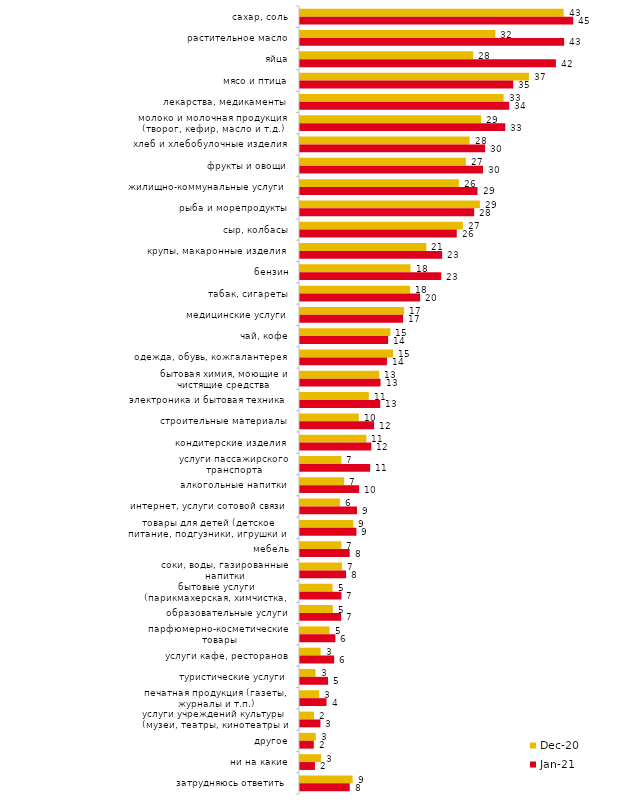
| Category | дек.20 | янв.21 |
|---|---|---|
| сахар, соль | 42.935 | 44.511 |
| растительное масло | 31.829 | 43.02 |
| яйца | 28.21 | 41.679 |
| мясо и птица | 37.283 | 34.724 |
| лекарства, медикаменты | 33.168 | 34.078 |
| молоко и молочная продукция (творог, кефир, масло и т.д.) | 29.499 | 33.433 |
| хлеб и хлебобулочные изделия | 27.615 | 30.154 |
| фрукты и овощи | 27.02 | 29.806 |
| жилищно-коммунальные услуги | 25.88 | 28.912 |
| рыба и морепродукты | 29.301 | 28.366 |
| сыр, колбасы | 26.525 | 25.534 |
| крупы, макаронные изделия | 20.575 | 23.15 |
| бензин | 17.997 | 23 |
| табак, сигареты | 17.947 | 19.573 |
| медицинские услуги | 16.956 | 16.791 |
| чай, кофе | 14.725 | 14.357 |
| одежда, обувь, кожгалантерея | 15.171 | 14.158 |
| бытовая химия, моющие и чистящие средства | 12.89 | 13.115 |
| электроника и бытовая техника | 11.205 | 13.065 |
| строительные материалы | 9.569 | 12.072 |
| кондитерские изделия | 10.808 | 11.624 |
| услуги пассажирского транспорта | 6.743 | 11.426 |
| алкогольные напитки | 7.189 | 9.637 |
| интернет, услуги сотовой связи | 6.495 | 9.29 |
| товары для детей (детское питание, подгузники, игрушки и т.п.) | 8.676 | 9.19 |
| мебель | 6.743 | 8.097 |
| соки, воды, газированные напитки | 6.842 | 7.501 |
| бытовые услуги (парикмахерская, химчистка, ателье и т.д.) | 5.305 | 6.756 |
| образовательные услуги | 5.354 | 6.706 |
| парфюмерно-косметические товары | 4.809 | 5.763 |
| услуги кафе, ресторанов | 3.371 | 5.564 |
| туристические услуги | 2.529 | 4.57 |
| печатная продукция (газеты, журналы и т.п.) | 3.123 | 4.322 |
| услуги учреждений культуры (музеи, театры, кинотеатры и т.п.) | 2.281 | 3.328 |
| другое | 2.578 | 2.235 |
| ни на какие | 3.421 | 2.434 |
| затрудняюсь ответить | 8.577 | 8.097 |